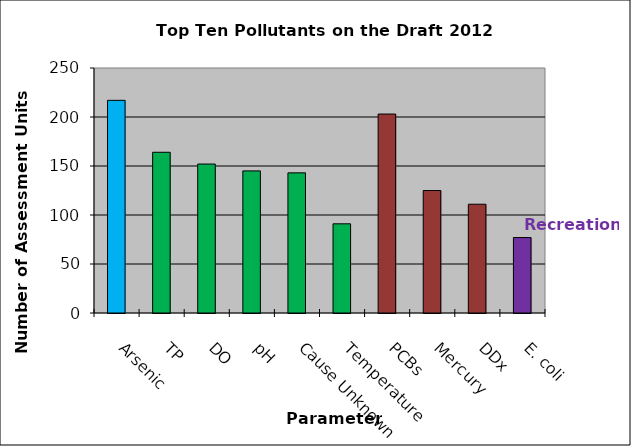
| Category | # of AUs |
|---|---|
| Arsenic | 217 |
| TP | 164 |
| DO | 152 |
| pH | 145 |
| Cause Unknown | 143 |
| Temperature | 91 |
| PCBs | 203 |
| Mercury | 125 |
| DDx | 111 |
| E. coli | 77 |